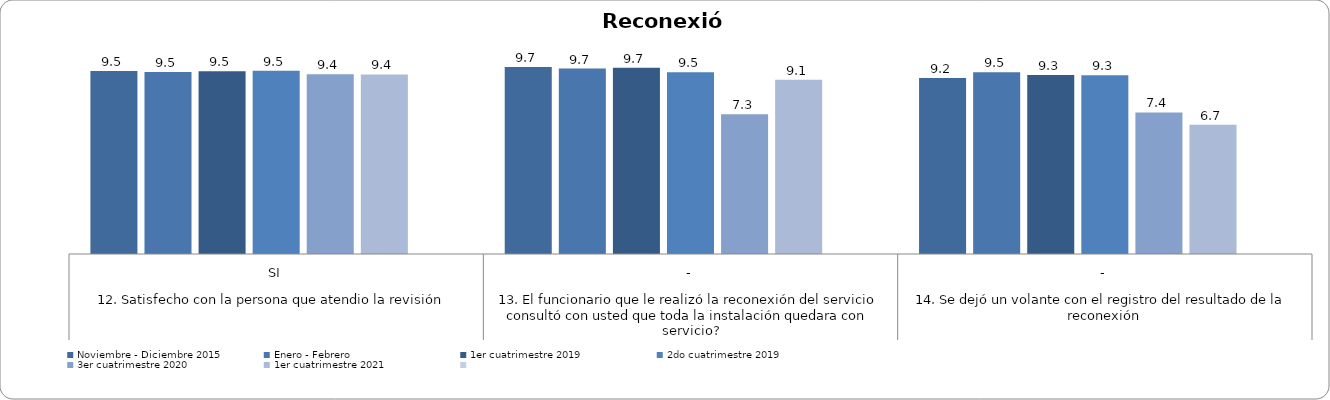
| Category | Noviembre - Diciembre 2015 | Enero - Febrero | 1er cuatrimestre 2019 | 2do cuatrimestre 2019 | 3er cuatrimestre 2020 | 1er cuatrimestre 2021 | Series 6 |
|---|---|---|---|---|---|---|---|
| 0 | 9.535 | 9.479 | 9.52 | 9.545 | 9.366 | 9.35 |  |
| 1 | 9.733 | 9.658 | 9.703 | 9.468 | 7.277 | 9.078 |  |
| 2 | 9.171 | 9.469 | 9.326 | 9.307 | 7.374 | 6.728 |  |